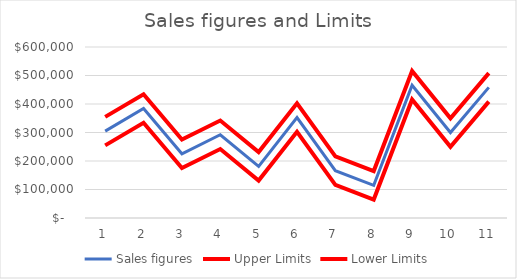
| Category | Sales figures | Upper Limits | Lower Limits |
|---|---|---|---|
| 0 | 304746 | 354746 | 254746 |
| 1 | 384263 | 434263 | 334263 |
| 2 | 225316 | 275316 | 175316 |
| 3 | 292096 | 342096 | 242096 |
| 4 | 181367 | 231367 | 131367 |
| 5 | 352317 | 402317 | 302317 |
| 6 | 166066 | 216066 | 116066 |
| 7 | 114753 | 164753 | 64753 |
| 8 | 465908 | 515908 | 415908 |
| 9 | 299766 | 349766 | 249766 |
| 10 | 458261 | 508261 | 408261 |